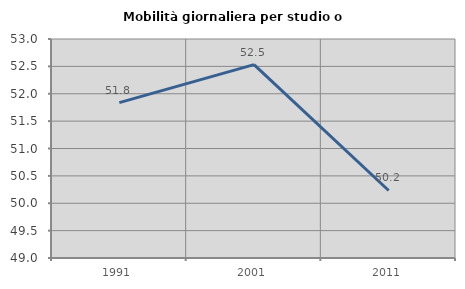
| Category | Mobilità giornaliera per studio o lavoro |
|---|---|
| 1991.0 | 51.838 |
| 2001.0 | 52.532 |
| 2011.0 | 50.233 |